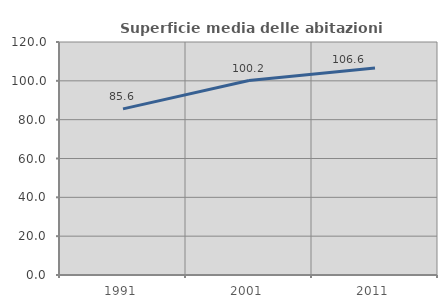
| Category | Superficie media delle abitazioni occupate |
|---|---|
| 1991.0 | 85.563 |
| 2001.0 | 100.171 |
| 2011.0 | 106.617 |